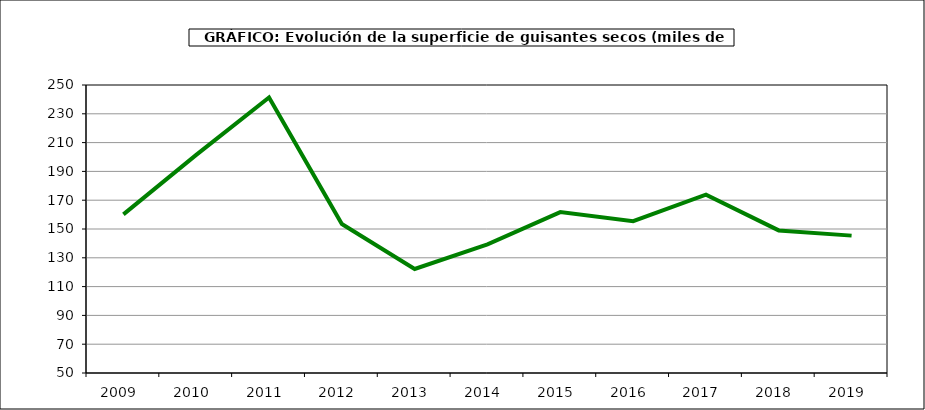
| Category | Superficie |
|---|---|
| 2009.0 | 160.173 |
| 2010.0 | 201.458 |
| 2011.0 | 241.347 |
| 2012.0 | 153.482 |
| 2013.0 | 122.246 |
| 2014.0 | 139.386 |
| 2015.0 | 161.746 |
| 2016.0 | 155.409 |
| 2017.0 | 173.854 |
| 2018.0 | 149.02 |
| 2019.0 | 145.399 |